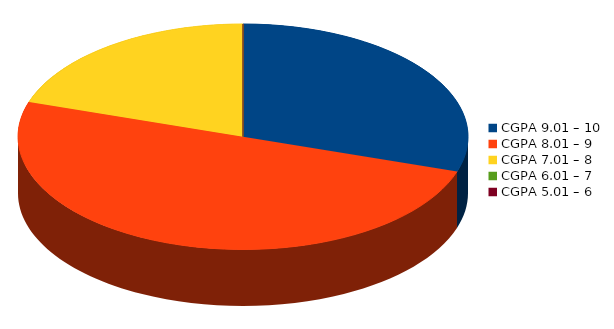
| Category | Number of students |
|---|---|
| CGPA 9.01 – 10 | 3 |
| CGPA 8.01 – 9 | 5 |
| CGPA 7.01 – 8 | 2 |
| CGPA 6.01 – 7 | 0 |
| CGPA 5.01 – 6 | 0 |